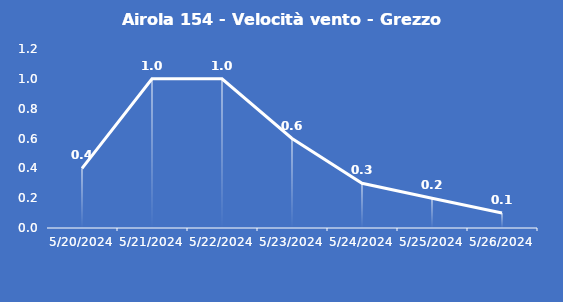
| Category | Airola 154 - Velocità vento - Grezzo (m/s) |
|---|---|
| 5/20/24 | 0.4 |
| 5/21/24 | 1 |
| 5/22/24 | 1 |
| 5/23/24 | 0.6 |
| 5/24/24 | 0.3 |
| 5/25/24 | 0.2 |
| 5/26/24 | 0.1 |